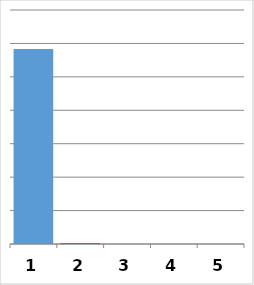
| Category | Series 0 |
|---|---|
| 0 | 5833114.21 |
| 1 | 19000 |
| 2 | 0 |
| 3 | 0 |
| 4 | 0 |